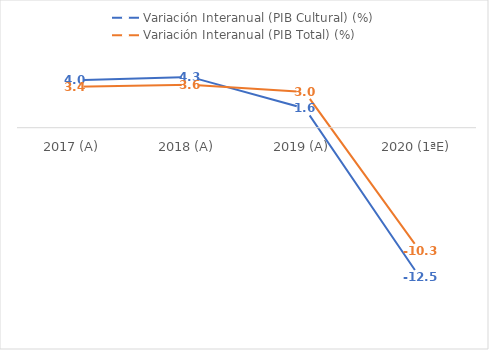
| Category | Variación Interanual (PIB Cultural) (%) | Variación Interanual (PIB Total) (%) |
|---|---|---|
| 2017 (A) | 3.961 | 3.43 |
| 2018 (A) | 4.252 | 3.586 |
| 2019 (A) | 1.609 | 2.98 |
| 2020 (1ªE) | -12.495 | -10.284 |